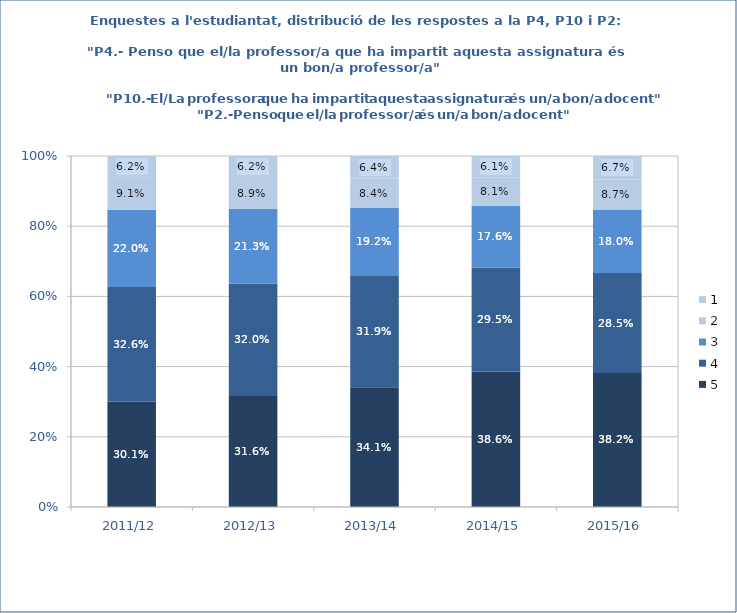
| Category | 5 | 4 | 3 | 2 | 1 |
|---|---|---|---|---|---|
| 2011/12 | 0.301 | 0.326 | 0.22 | 0.091 | 0.062 |
| 2012/13 | 0.316 | 0.32 | 0.213 | 0.089 | 0.062 |
| 2013/14 | 0.341 | 0.319 | 0.192 | 0.084 | 0.064 |
| 2014/15 | 0.386 | 0.295 | 0.176 | 0.081 | 0.061 |
| 2015/16 | 0.382 | 0.285 | 0.18 | 0.087 | 0.067 |